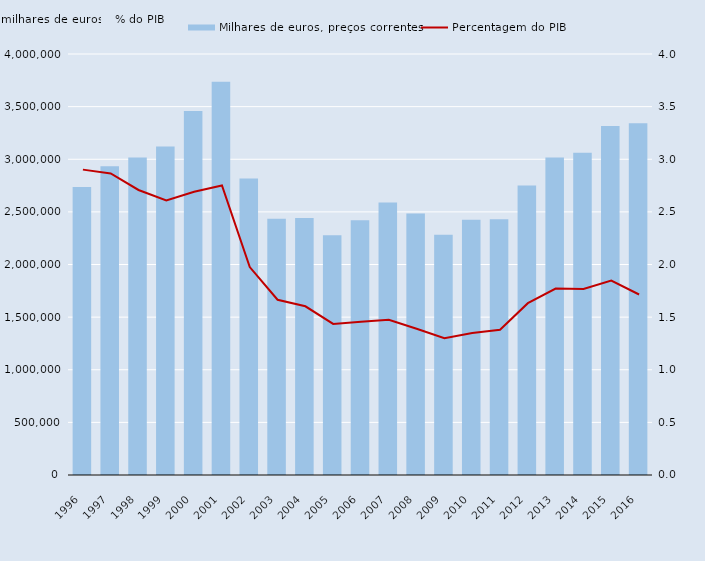
| Category | Milhares de euros, preços correntes |
|---|---|
| 1996.0 | 2737490 |
| 1997.0 | 2932550 |
| 1998.0 | 3016290 |
| 1999.0 | 3121680 |
| 2000.0 | 3458120 |
| 2001.0 | 3736820 |
| 2002.0 | 2817880 |
| 2003.0 | 2433780 |
| 2004.0 | 2442160 |
| 2005.0 | 2277250 |
| 2006.0 | 2420270 |
| 2007.0 | 2588420 |
| 2008.0 | 2484680 |
| 2009.0 | 2281870 |
| 2010.0 | 2425900 |
| 2011.0 | 2430490 |
| 2012.0 | 2749460 |
| 2013.0 | 3015780 |
| 2014.0 | 3060710 |
| 2015.0 | 3315620 |
| 2016.0 | 3343200 |